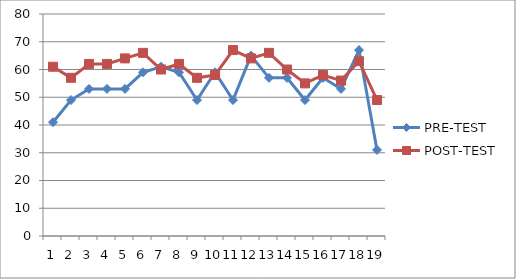
| Category | PRE-TEST | POST-TEST |
|---|---|---|
| 0 | 41 | 61 |
| 1 | 49 | 57 |
| 2 | 53 | 62 |
| 3 | 53 | 62 |
| 4 | 53 | 64 |
| 5 | 59 | 66 |
| 6 | 61 | 60 |
| 7 | 59 | 62 |
| 8 | 49 | 57 |
| 9 | 59 | 58 |
| 10 | 49 | 67 |
| 11 | 65 | 64 |
| 12 | 57 | 66 |
| 13 | 57 | 60 |
| 14 | 49 | 55 |
| 15 | 57 | 58 |
| 16 | 53 | 56 |
| 17 | 67 | 63 |
| 18 | 31 | 49 |